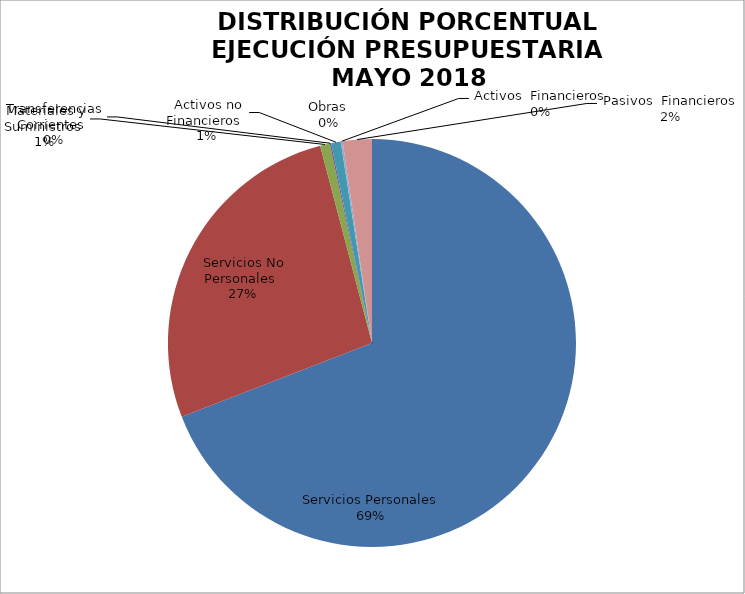
| Category | Series 0 | Series 1 |
|---|---|---|
| Servicios Personales | 12062060.67 | 0.725 |
| Servicios No Personales | 4674484.86 | 0.281 |
| Materiales y Suministros | 134201.86 | 0.008 |
| Transferencias Corrientes | 20000 | 0 |
| Activos no Financieros | 131820.75 | 0.008 |
| Obras | 0 | 0 |
| Activos  Financieros | 25600 | 0.002 |
| Pasivos  Financieros | -402236.34 | -0.024 |